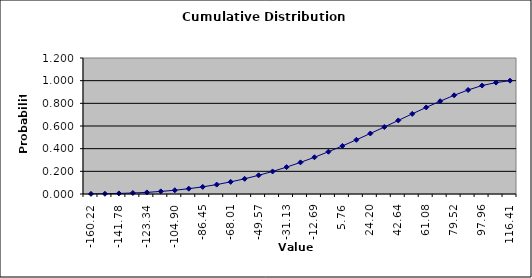
| Category | DISTRIBUTION SCHEDULE |
|---|---|
| -160.2223248591007 | 0.001 |
| -151.0013616483473 | 0.002 |
| -141.78039843759393 | 0.005 |
| -132.55943522684055 | 0.009 |
| -123.33847201608717 | 0.014 |
| -114.11750880533378 | 0.023 |
| -104.8965455945804 | 0.033 |
| -95.67558238382702 | 0.047 |
| -86.45461917307364 | 0.063 |
| -77.23365596232026 | 0.083 |
| -68.01269275156687 | 0.107 |
| -58.791729540813485 | 0.134 |
| -49.570766330060096 | 0.165 |
| -40.349803119306706 | 0.199 |
| -31.128839908553317 | 0.237 |
| -21.907876697799928 | 0.279 |
| -12.68691348704654 | 0.324 |
| -3.465950276293153 | 0.373 |
| 5.755012934460234 | 0.424 |
| 14.975976145213622 | 0.478 |
| 24.19693935596701 | 0.534 |
| 33.4179025667204 | 0.591 |
| 42.63886577747379 | 0.649 |
| 51.85982898822718 | 0.707 |
| 61.08079219898057 | 0.764 |
| 70.30175540973396 | 0.819 |
| 79.52271862048734 | 0.871 |
| 88.74368183124072 | 0.918 |
| 97.9646450419941 | 0.957 |
| 105.86832779406843 | 0.983 |
| 116.40657146350095 | 1 |